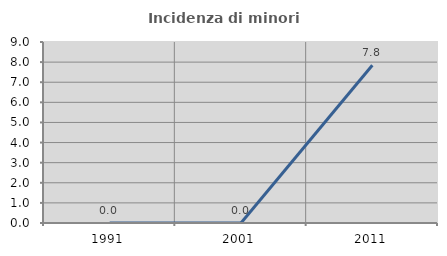
| Category | Incidenza di minori stranieri |
|---|---|
| 1991.0 | 0 |
| 2001.0 | 0 |
| 2011.0 | 7.843 |